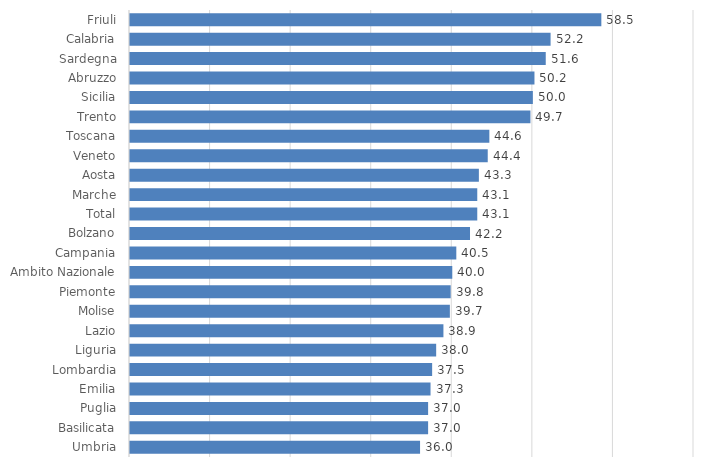
| Category | Series 0 |
|---|---|
| Friuli | 58.5 |
| Calabria | 52.2 |
| Sardegna | 51.6 |
| Abruzzo | 50.2 |
| Sicilia | 50 |
| Trento | 49.7 |
| Toscana | 44.6 |
| Veneto | 44.4 |
| Aosta | 43.3 |
| Marche | 43.1 |
| Total | 43.1 |
| Bolzano | 42.2 |
| Campania | 40.5 |
| Ambito Nazionale | 40 |
| Piemonte | 39.8 |
| Molise | 39.7 |
| Lazio | 38.9 |
| Liguria | 38 |
| Lombardia | 37.5 |
| Emilia | 37.3 |
| Puglia | 37 |
| Basilicata | 37 |
| Umbria | 36 |